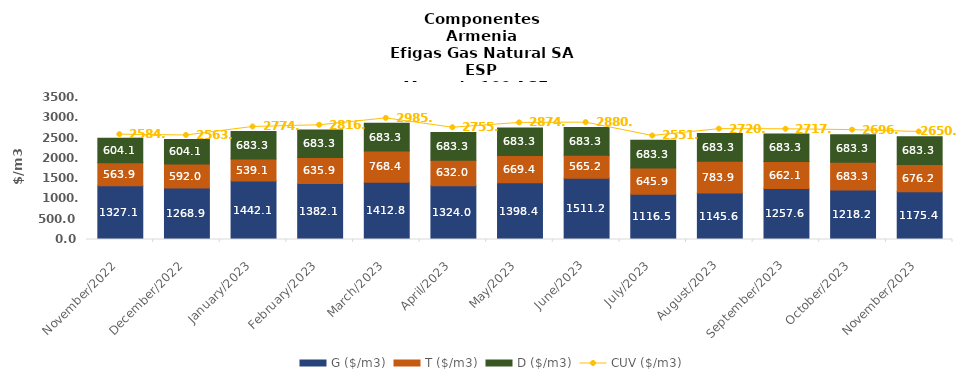
| Category | G ($/m3) | T ($/m3) | D ($/m3) |
|---|---|---|---|
| 2022-11-01 | 1327.14 | 563.85 | 604.09 |
| 2022-12-01 | 1268.91 | 592.03 | 604.09 |
| 2023-01-01 | 1442.084 | 539.064 | 683.343 |
| 2023-02-01 | 1382.137 | 635.944 | 683.343 |
| 2023-03-01 | 1412.843 | 768.353 | 683.343 |
| 2023-04-01 | 1324.021 | 631.998 | 683.343 |
| 2023-05-01 | 1398.419 | 669.403 | 683.343 |
| 2023-06-01 | 1511.242 | 565.219 | 683.343 |
| 2023-07-01 | 1116.463 | 645.939 | 683.343 |
| 2023-08-01 | 1145.565 | 783.894 | 683.343 |
| 2023-09-01 | 1257.568 | 662.12 | 683.343 |
| 2023-10-01 | 1218.237 | 683.343 | 683.34 |
| 2023-11-01 | 1175.364 | 676.175 | 683.343 |